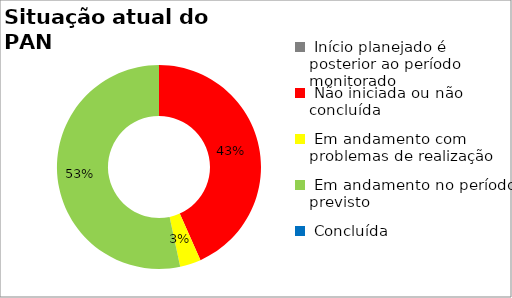
| Category | Series 0 |
|---|---|
|  Início planejado é posterior ao período monitorado | 0 |
|  Não iniciada ou não concluída | 0.433 |
|  Em andamento com problemas de realização | 0.033 |
|  Em andamento no período previsto  | 0.533 |
|  Concluída | 0 |